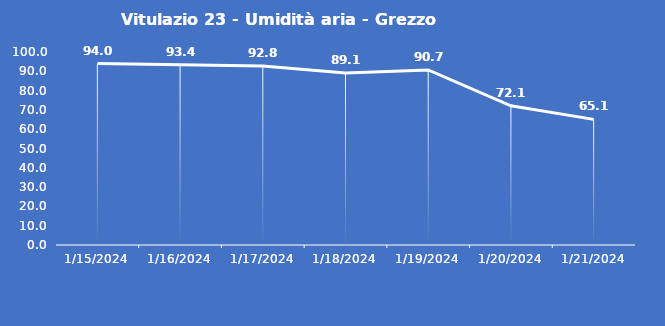
| Category | Vitulazio 23 - Umidità aria - Grezzo (%) |
|---|---|
| 1/15/24 | 94 |
| 1/16/24 | 93.4 |
| 1/17/24 | 92.8 |
| 1/18/24 | 89.1 |
| 1/19/24 | 90.7 |
| 1/20/24 | 72.1 |
| 1/21/24 | 65.1 |